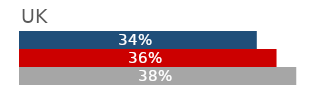
| Category | UK |
|---|---|
| 2006 | 0.34 |
| 2011 | 0.36 |
| 2016 | 0.38 |